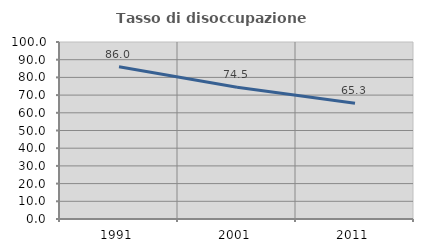
| Category | Tasso di disoccupazione giovanile  |
|---|---|
| 1991.0 | 85.992 |
| 2001.0 | 74.49 |
| 2011.0 | 65.333 |